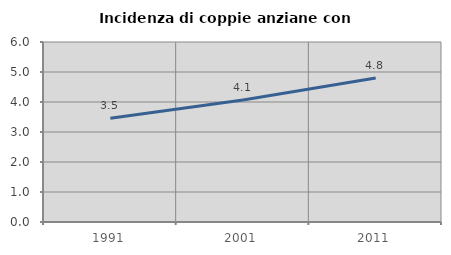
| Category | Incidenza di coppie anziane con figli |
|---|---|
| 1991.0 | 3.461 |
| 2001.0 | 4.063 |
| 2011.0 | 4.802 |